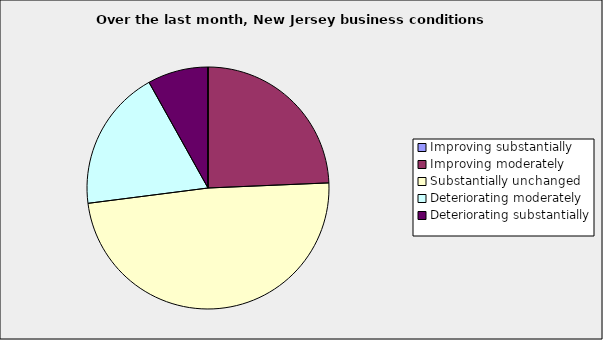
| Category | Series 0 |
|---|---|
| Improving substantially | 0 |
| Improving moderately | 0.243 |
| Substantially unchanged | 0.486 |
| Deteriorating moderately | 0.189 |
| Deteriorating substantially | 0.081 |